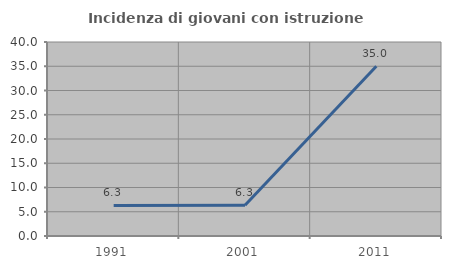
| Category | Incidenza di giovani con istruzione universitaria |
|---|---|
| 1991.0 | 6.306 |
| 2001.0 | 6.338 |
| 2011.0 | 35 |